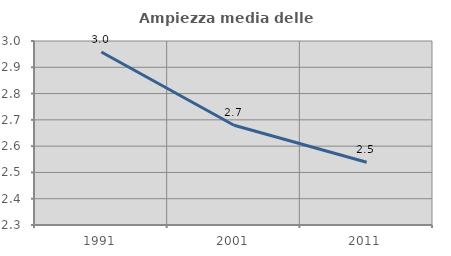
| Category | Ampiezza media delle famiglie |
|---|---|
| 1991.0 | 2.958 |
| 2001.0 | 2.68 |
| 2011.0 | 2.538 |